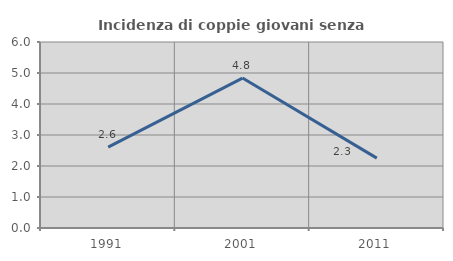
| Category | Incidenza di coppie giovani senza figli |
|---|---|
| 1991.0 | 2.611 |
| 2001.0 | 4.836 |
| 2011.0 | 2.254 |